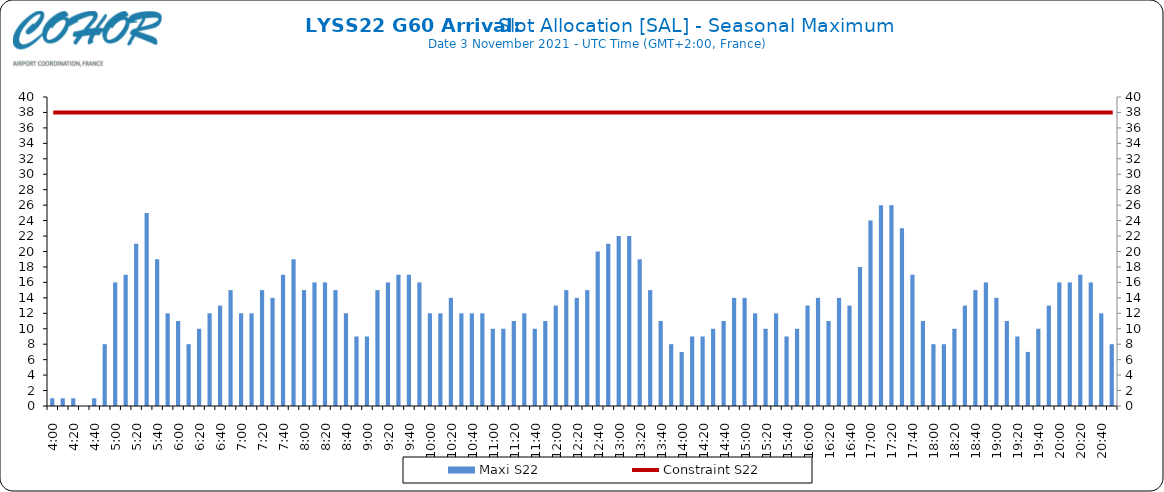
| Category | Maxi S22 |
|---|---|
| 0.16666666666666666 | 1 |
| 0.17361111111111113 | 1 |
| 0.18055555555555555 | 1 |
| 0.1875 | 0 |
| 0.19444444444444445 | 1 |
| 0.20138888888888887 | 8 |
| 0.20833333333333334 | 16 |
| 0.2152777777777778 | 17 |
| 0.2222222222222222 | 21 |
| 0.22916666666666666 | 25 |
| 0.23611111111111113 | 19 |
| 0.24305555555555555 | 12 |
| 0.25 | 11 |
| 0.2569444444444445 | 8 |
| 0.2638888888888889 | 10 |
| 0.2708333333333333 | 12 |
| 0.2777777777777778 | 13 |
| 0.2847222222222222 | 15 |
| 0.2916666666666667 | 12 |
| 0.2986111111111111 | 12 |
| 0.3055555555555555 | 15 |
| 0.3125 | 14 |
| 0.3194444444444445 | 17 |
| 0.3263888888888889 | 19 |
| 0.3333333333333333 | 15 |
| 0.34027777777777773 | 16 |
| 0.34722222222222227 | 16 |
| 0.3541666666666667 | 15 |
| 0.3611111111111111 | 12 |
| 0.3680555555555556 | 9 |
| 0.375 | 9 |
| 0.3819444444444444 | 15 |
| 0.3888888888888889 | 16 |
| 0.3958333333333333 | 17 |
| 0.40277777777777773 | 17 |
| 0.40972222222222227 | 16 |
| 0.4166666666666667 | 12 |
| 0.4236111111111111 | 12 |
| 0.4305555555555556 | 14 |
| 0.4375 | 12 |
| 0.4444444444444444 | 12 |
| 0.4513888888888889 | 12 |
| 0.4583333333333333 | 10 |
| 0.46527777777777773 | 10 |
| 0.47222222222222227 | 11 |
| 0.4791666666666667 | 12 |
| 0.4861111111111111 | 10 |
| 0.4930555555555556 | 11 |
| 0.5 | 13 |
| 0.5069444444444444 | 15 |
| 0.513888888888889 | 14 |
| 0.5208333333333334 | 15 |
| 0.5277777777777778 | 20 |
| 0.5347222222222222 | 21 |
| 0.5416666666666666 | 22 |
| 0.548611111111111 | 22 |
| 0.5555555555555556 | 19 |
| 0.5625 | 15 |
| 0.5694444444444444 | 11 |
| 0.576388888888889 | 8 |
| 0.5833333333333334 | 7 |
| 0.5902777777777778 | 9 |
| 0.5972222222222222 | 9 |
| 0.6041666666666666 | 10 |
| 0.611111111111111 | 11 |
| 0.6180555555555556 | 14 |
| 0.625 | 14 |
| 0.6319444444444444 | 12 |
| 0.638888888888889 | 10 |
| 0.6458333333333334 | 12 |
| 0.6527777777777778 | 9 |
| 0.6597222222222222 | 10 |
| 0.6666666666666666 | 13 |
| 0.6736111111111112 | 14 |
| 0.6805555555555555 | 11 |
| 0.6875 | 14 |
| 0.6944444444444445 | 13 |
| 0.7013888888888888 | 18 |
| 0.7083333333333334 | 24 |
| 0.7152777777777778 | 26 |
| 0.7222222222222222 | 26 |
| 0.7291666666666666 | 23 |
| 0.7361111111111112 | 17 |
| 0.7430555555555555 | 11 |
| 0.75 | 8 |
| 0.7569444444444445 | 8 |
| 0.7638888888888888 | 10 |
| 0.7708333333333334 | 13 |
| 0.7777777777777778 | 15 |
| 0.7847222222222222 | 16 |
| 0.7916666666666666 | 14 |
| 0.7986111111111112 | 11 |
| 0.8055555555555555 | 9 |
| 0.8125 | 7 |
| 0.8194444444444445 | 10 |
| 0.8263888888888888 | 13 |
| 0.8333333333333334 | 16 |
| 0.8402777777777778 | 16 |
| 0.8472222222222222 | 17 |
| 0.8541666666666666 | 16 |
| 0.8611111111111112 | 12 |
| 0.8680555555555555 | 8 |